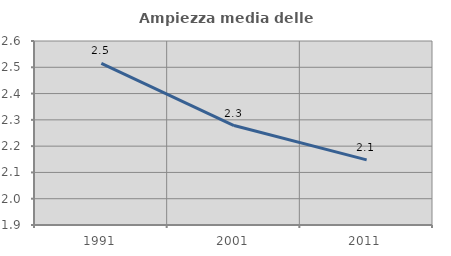
| Category | Ampiezza media delle famiglie |
|---|---|
| 1991.0 | 2.515 |
| 2001.0 | 2.278 |
| 2011.0 | 2.148 |